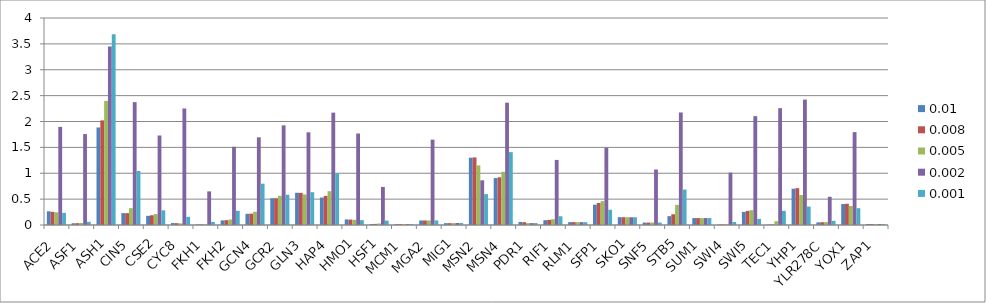
| Category | 0.01 | 0.008 | 0.005 | 0.002 | 0.001 |
|---|---|---|---|---|---|
| ACE2 | 0.265 | 0.254 | 0.245 | 1.896 | 0.235 |
| ASF1 | 0.035 | 0.036 | 0.038 | 1.758 | 0.061 |
| ASH1 | 1.884 | 2.022 | 2.398 | 3.449 | 3.688 |
| CIN5 | 0.229 | 0.229 | 0.325 | 2.375 | 1.044 |
| CSE2 | 0.177 | 0.188 | 0.212 | 1.729 | 0.284 |
| CYC8 | 0.038 | 0.036 | 0.031 | 2.252 | 0.157 |
| FKH1 | 0.01 | 0.011 | 0.011 | 0.65 | 0.059 |
| FKH2 | 0.089 | 0.094 | 0.106 | 1.511 | 0.275 |
| GCN4 | 0.216 | 0.219 | 0.256 | 1.694 | 0.798 |
| GCR2 | 0.517 | 0.516 | 0.564 | 1.926 | 0.585 |
| GLN3 | 0.623 | 0.62 | 0.59 | 1.791 | 0.634 |
| HAP4 | 0.53 | 0.563 | 0.653 | 2.171 | 1.001 |
| HMO1 | 0.107 | 0.105 | 0.1 | 1.768 | 0.094 |
| HSF1 | 0.019 | 0.021 | 0.029 | 0.736 | 0.085 |
| MCM1 | 0.017 | 0.017 | 0.018 | 0.018 | 0.018 |
| MGA2 | 0.088 | 0.088 | 0.088 | 1.65 | 0.088 |
| MIG1 | 0.035 | 0.036 | 0.037 | 0.038 | 0.039 |
| MSN2 | 1.3 | 1.306 | 1.152 | 0.864 | 0.597 |
| MSN4 | 0.907 | 0.921 | 1.029 | 2.364 | 1.408 |
| PDR1 | 0.059 | 0.054 | 0.037 | 0.036 | 0.037 |
| RIF1 | 0.093 | 0.099 | 0.112 | 1.258 | 0.168 |
| RLM1 | 0.056 | 0.055 | 0.055 | 0.055 | 0.055 |
| SFP1 | 0.392 | 0.426 | 0.462 | 1.494 | 0.295 |
| SKO1 | 0.152 | 0.151 | 0.15 | 0.149 | 0.149 |
| SNF5 | 0.047 | 0.047 | 0.047 | 1.072 | 0.047 |
| STB5 | 0.171 | 0.207 | 0.388 | 2.174 | 0.685 |
| SUM1 | 0.133 | 0.133 | 0.134 | 0.134 | 0.134 |
| SWI4 | 0.008 | 0.009 | 0.015 | 1.012 | 0.059 |
| SWI5 | 0.253 | 0.273 | 0.286 | 2.103 | 0.119 |
| TEC1 | 0.009 | 0.01 | 0.073 | 2.258 | 0.273 |
| YHP1 | 0.701 | 0.712 | 0.58 | 2.423 | 0.356 |
| YLR278C | 0.051 | 0.054 | 0.056 | 0.546 | 0.081 |
| YOX1 | 0.405 | 0.41 | 0.367 | 1.795 | 0.325 |
| ZAP1 | 0.019 | 0.019 | 0.02 | 0.02 | 0.02 |